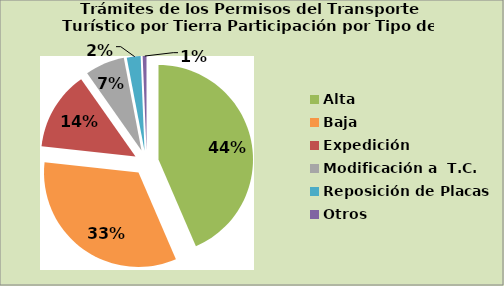
| Category | Series 0 |
|---|---|
| Alta                                         | 43.523 |
| Baja | 33.22 |
| Expedición | 13.506 |
| Modificación a  T.C. | 6.745 |
| Reposición de Placas | 2.357 |
| Otros | 0.65 |